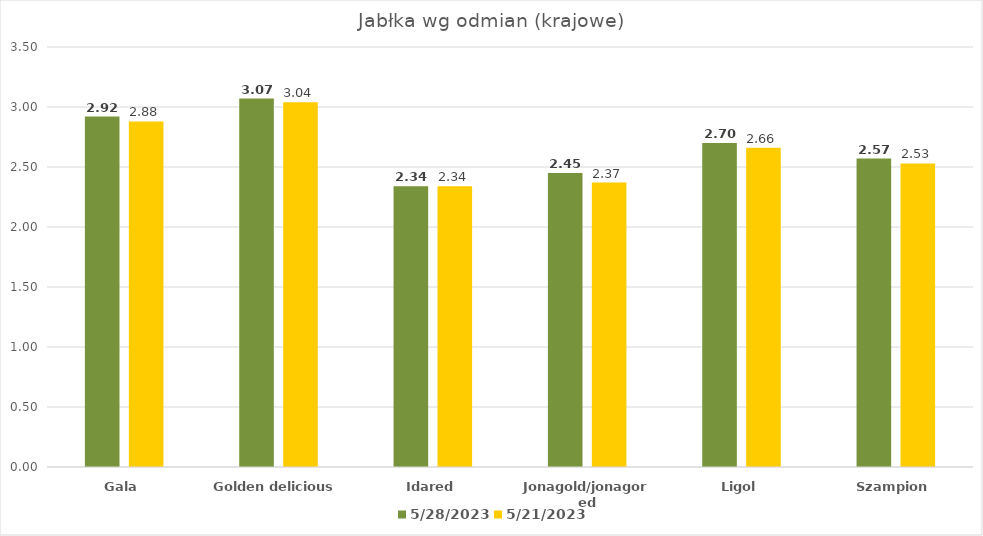
| Category | 28.05.2023 | 21.05.2023 |
|---|---|---|
| Gala | 2.92 | 2.88 |
| Golden delicious | 3.07 | 3.04 |
| Idared | 2.34 | 2.34 |
| Jonagold/jonagored | 2.45 | 2.37 |
| Ligol | 2.7 | 2.66 |
| Szampion | 2.57 | 2.53 |